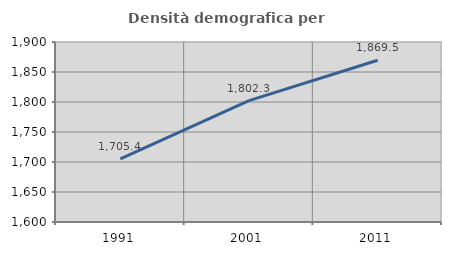
| Category | Densità demografica |
|---|---|
| 1991.0 | 1705.352 |
| 2001.0 | 1802.263 |
| 2011.0 | 1869.538 |